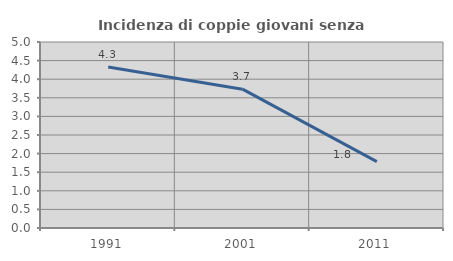
| Category | Incidenza di coppie giovani senza figli |
|---|---|
| 1991.0 | 4.328 |
| 2001.0 | 3.732 |
| 2011.0 | 1.784 |